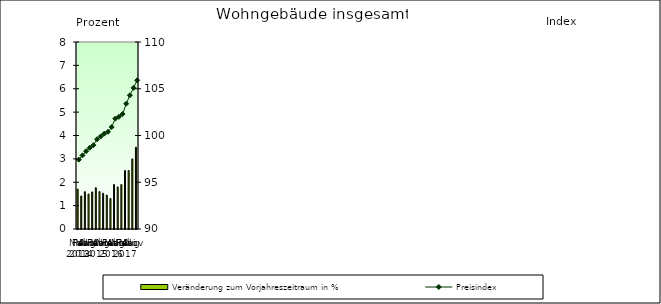
| Category | Veränderung zum Vorjahreszeitraum in % |
|---|---|
| 0 | 1.708 |
| 1 | 1.412 |
| 2 | 1.596 |
| 3 | 1.495 |
| 4 | 1.586 |
| 5 | 1.764 |
| 6 | 1.599 |
| 7 | 1.529 |
| 8 | 1.451 |
| 9 | 1.305 |
| 10 | 1.902 |
| 11 | 1.8 |
| 12 | 1.9 |
| 13 | 2.5 |
| 14 | 2.5 |
| 15 | 3 |
| 16 | 3.5 |